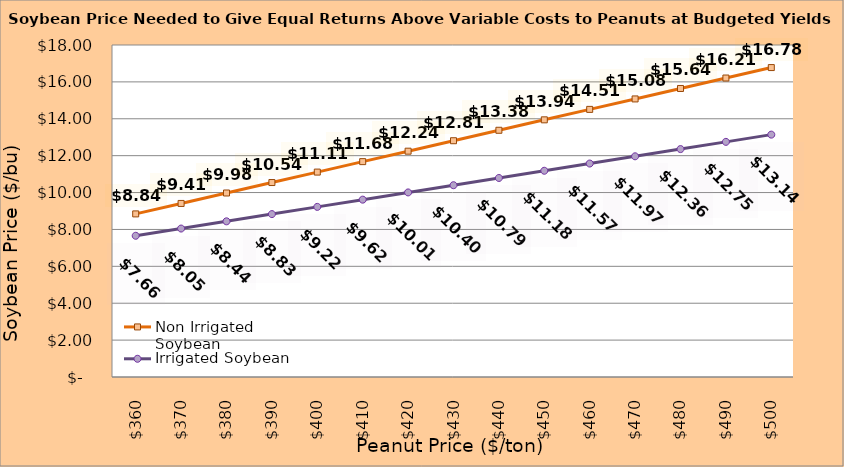
| Category | Non Irrigated Soybean | Irrigated Soybean |
|---|---|---|
| 360.0 | 8.843 | 7.657 |
| 370.0 | 9.41 | 8.048 |
| 380.0 | 9.976 | 8.44 |
| 390.0 | 10.543 | 8.832 |
| 400.0 | 11.11 | 9.223 |
| 410.0 | 11.676 | 9.615 |
| 420.0 | 12.243 | 10.007 |
| 430.0 | 12.81 | 10.398 |
| 440.0 | 13.376 | 10.79 |
| 450.0 | 13.943 | 11.182 |
| 460.0 | 14.51 | 11.573 |
| 470.0 | 15.076 | 11.965 |
| 480.0 | 15.643 | 12.357 |
| 490.0 | 16.21 | 12.748 |
| 500.0 | 16.776 | 13.14 |